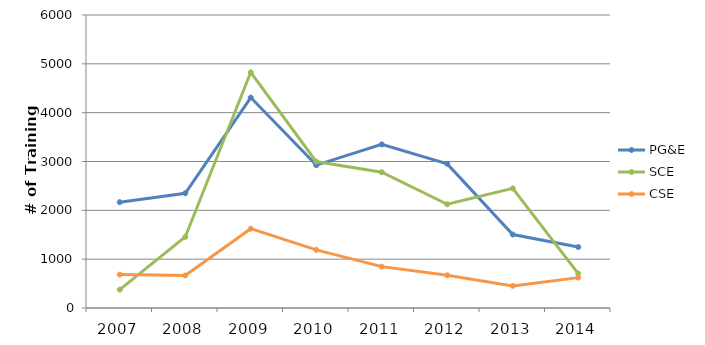
| Category | PG&E | SCE | CSE |
|---|---|---|---|
| 2007.0 | 2167 | 376 | 684 |
| 2008.0 | 2350 | 1455 | 666 |
| 2009.0 | 4310 | 4827 | 1624 |
| 2010.0 | 2925 | 2999 | 1190 |
| 2011.0 | 3350 | 2781 | 847 |
| 2012.0 | 2951 | 2124 | 669 |
| 2013.0 | 1505 | 2450 | 453 |
| 2014.0 | 1248 | 703 | 622 |